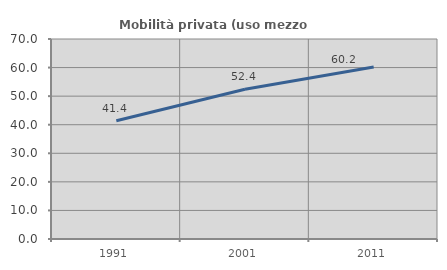
| Category | Mobilità privata (uso mezzo privato) |
|---|---|
| 1991.0 | 41.379 |
| 2001.0 | 52.427 |
| 2011.0 | 60.214 |